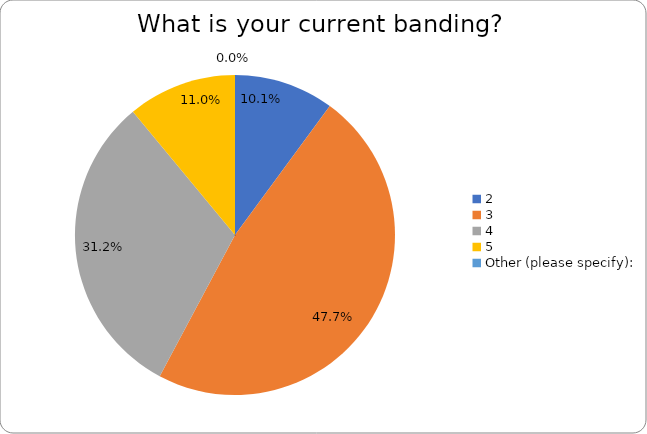
| Category | Series 0 |
|---|---|
| 2 | 0.101 |
| 3 | 0.477 |
| 4 | 0.312 |
| 5 | 0.11 |
| Other (please specify): | 0 |